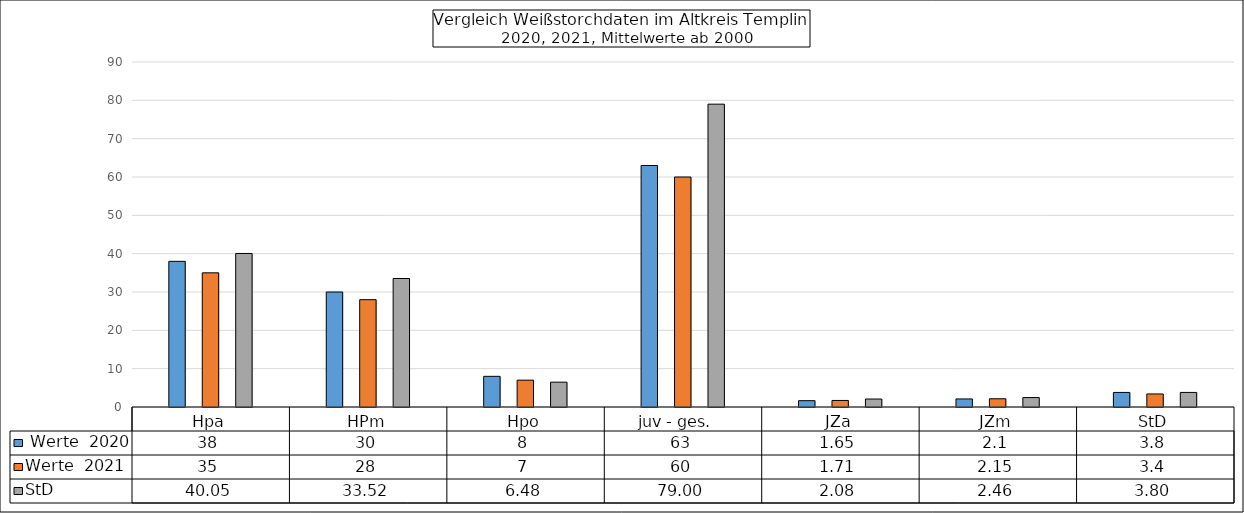
| Category |  Werte  2020 | Werte  2021 | StD |
|---|---|---|---|
| Hpa | 38 | 35 | 40.05 |
| HPm | 30 | 28 | 33.52 |
| Hpo | 8 | 7 | 6.48 |
| juv - ges.   | 63 | 60 | 79 |
| JZa | 1.65 | 1.71 | 2.08 |
| JZm | 2.1 | 2.15 | 2.46 |
| StD | 3.8 | 3.4 | 3.8 |